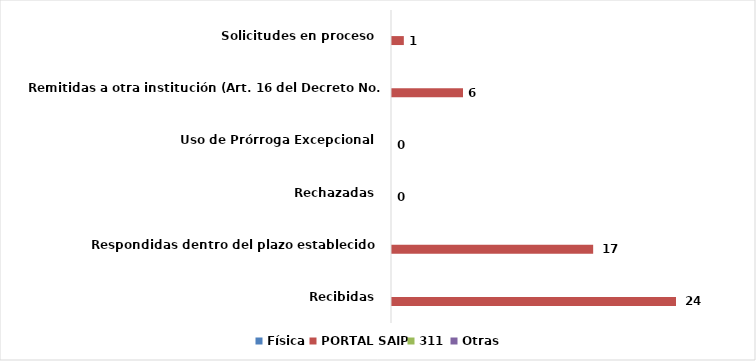
| Category | Física | PORTAL SAIP | 311 | Otras |
|---|---|---|---|---|
| Recibidas  | 0 | 24 | 0 | 0 |
| Respondidas dentro del plazo establecido  | 0 | 17 | 0 | 0 |
| Rechazadas  | 0 | 0 | 0 | 0 |
| Uso de Prórroga Excepcional  | 0 | 0 | 0 | 0 |
| Remitidas a otra institución (Art. 16 del Decreto No. 130-05)  | 0 | 6 | 0 | 0 |
| Solicitudes en proceso  | 0 | 1 | 0 | 0 |